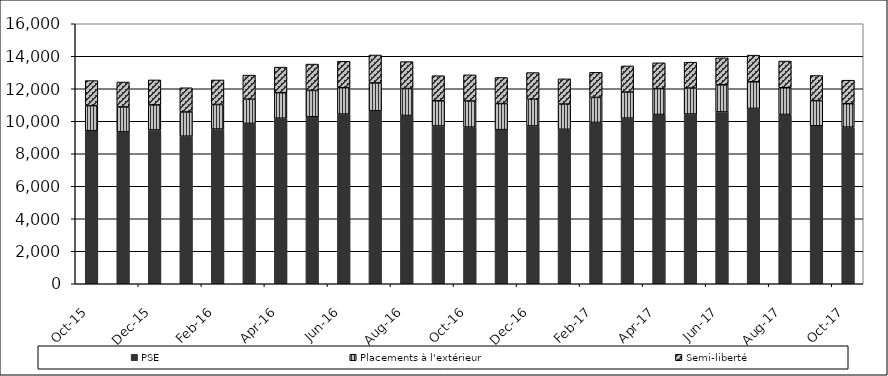
| Category | PSE | Placements à l'extérieur | Semi-liberté |
|---|---|---|---|
| 2015-10-01 | 9420 | 1542 | 1542 |
| 2015-11-01 | 9350 | 1533 | 1533 |
| 2015-12-01 | 9466 | 1539 | 1539 |
| 2016-01-01 | 9081 | 1490 | 1490 |
| 2016-02-01 | 9521 | 1510 | 1510 |
| 2016-03-01 | 9868 | 1486 | 1486 |
| 2016-04-01 | 10187 | 1572 | 1572 |
| 2016-05-01 | 10278 | 1621 | 1621 |
| 2016-06-01 | 10441 | 1625 | 1625 |
| 2016-07-01 | 10642 | 1718 | 1718 |
| 2016-08-01 | 10355 | 1658 | 1658 |
| 2016-09-01 | 9712 | 1546 | 1546 |
| 2016-10-01 | 9640 | 1607 | 1607 |
| 2016-11-01 | 9484 | 1605 | 1605 |
| 2016-12-01 | 9714 | 1641 | 1641 |
| 2017-01-01 | 9505 | 1553 | 1553 |
| 2017-02-01 | 9927 | 1542 | 1542 |
| 2017-03-01 | 10190 | 1607 | 1607 |
| 2017-04-01 | 10417 | 1590 | 1590 |
| 2017-05-01 | 10448 | 1594 | 1594 |
| 2017-06-01 | 10575 | 1664 | 1664 |
| 2017-07-01 | 10791 | 1639 | 1639 |
| 2017-08-01 | 10417 | 1644 | 1644 |
| 2017-09-01 | 9723 | 1547 | 1547 |
| 2017-10-01 | 9637 | 1445 | 1445 |